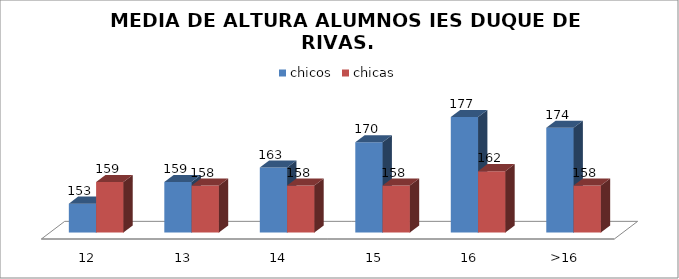
| Category | chicos | chicas |
|---|---|---|
| 12 | 153 | 159 |
| 13 | 159 | 158 |
| 14 | 163 | 158 |
| 15 | 170 | 158 |
| 16 | 177 | 162 |
| >16 | 174 | 158 |